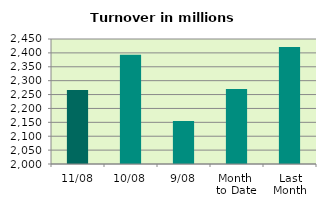
| Category | Series 0 |
|---|---|
| 11/08 | 2266.049 |
| 10/08 | 2392.992 |
| 9/08 | 2154.582 |
| Month 
to Date | 2270.068 |
| Last
Month | 2421.628 |